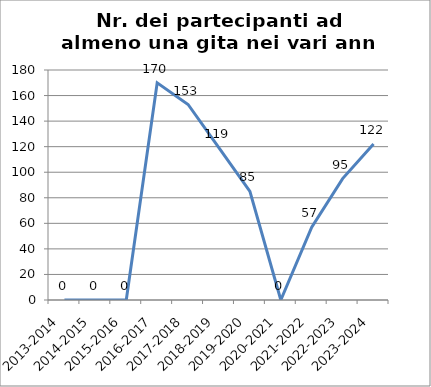
| Category | Nr. Partecipanti ad almeno una Gita |
|---|---|
| 2013-2014 | 0 |
| 2014-2015 | 0 |
| 2015-2016 | 0 |
| 2016-2017 | 170 |
| 2017-2018 | 153 |
| 2018-2019 | 119 |
| 2019-2020 | 85 |
| 2020-2021 | 0 |
| 2021-2022 | 57 |
| 2022-2023 | 95 |
| 2023-2024 | 122 |